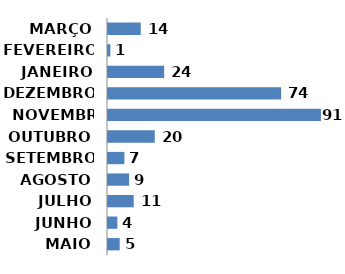
| Category | Series 0 |
|---|---|
| MAIO | 5 |
| JUNHO | 4 |
| JULHO | 11 |
| AGOSTO | 9 |
| SETEMBRO | 7 |
| OUTUBRO | 20 |
| NOVEMBRO | 91 |
| DEZEMBRO | 74 |
| JANEIRO | 24 |
| FEVEREIRO | 1 |
| MARÇO | 14 |